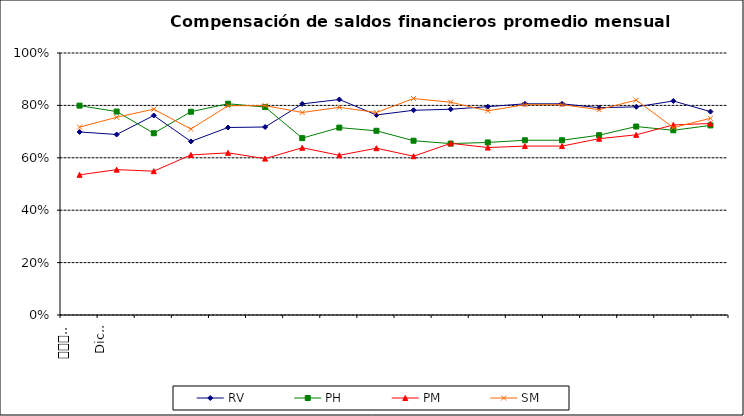
| Category | RV | PH | PM | SM |
|---|---|---|---|---|
| 0 | 0.699 | 0.799 | 0.535 | 0.717 |
| 1 | 0.689 | 0.776 | 0.555 | 0.755 |
| 2 | 0.762 | 0.694 | 0.549 | 0.786 |
| 3 | 0.662 | 0.776 | 0.611 | 0.71 |
| 4 | 0.716 | 0.806 | 0.619 | 0.799 |
| 5 | 0.718 | 0.794 | 0.597 | 0.799 |
| 6 | 0.806 | 0.675 | 0.638 | 0.773 |
| 7 | 0.823 | 0.715 | 0.61 | 0.793 |
| 8 | 0.764 | 0.703 | 0.637 | 0.773 |
| 9 | 0.781 | 0.665 | 0.606 | 0.826 |
| 10 | 0.785 | 0.654 | 0.655 | 0.812 |
| 11 | 0.795 | 0.659 | 0.639 | 0.779 |
| 12 | 0.806 | 0.667 | 0.645 | 0.803 |
| 13 | 0.806 | 0.667 | 0.645 | 0.803 |
| 14 | 0.791 | 0.686 | 0.673 | 0.784 |
| 15 | 0.794 | 0.719 | 0.688 | 0.82 |
| 16 | 0.817 | 0.705 | 0.726 | 0.715 |
| 17 | 0.776 | 0.724 | 0.731 | 0.751 |